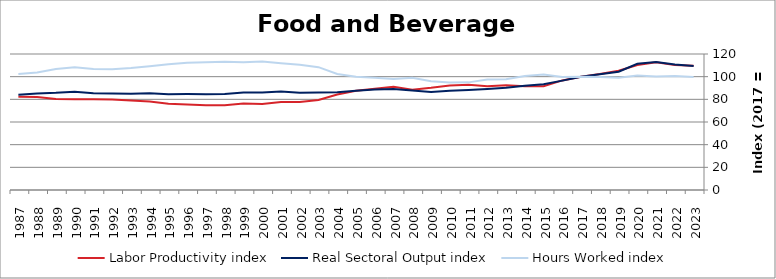
| Category | Labor Productivity index | Real Sectoral Output index | Hours Worked index |
|---|---|---|---|
| 2023.0 | 109.742 | 109.37 | 99.661 |
| 2022.0 | 110.192 | 110.782 | 100.536 |
| 2021.0 | 112.767 | 112.848 | 100.071 |
| 2020.0 | 110.234 | 111.313 | 100.98 |
| 2019.0 | 105.302 | 104.385 | 99.129 |
| 2018.0 | 102.443 | 102.046 | 99.612 |
| 2017.0 | 100 | 100 | 100 |
| 2016.0 | 96.7 | 96.519 | 99.812 |
| 2015.0 | 91.488 | 93.223 | 101.896 |
| 2014.0 | 91.461 | 92.039 | 100.632 |
| 2013.0 | 92.357 | 90.233 | 97.7 |
| 2012.0 | 91.45 | 89.077 | 97.406 |
| 2011.0 | 92.947 | 88.273 | 94.971 |
| 2010.0 | 92.263 | 87.505 | 94.843 |
| 2009.0 | 90.134 | 86.412 | 95.871 |
| 2008.0 | 88.504 | 87.692 | 99.082 |
| 2007.0 | 90.994 | 89.109 | 97.929 |
| 2006.0 | 89.434 | 88.599 | 99.067 |
| 2005.0 | 87.636 | 87.562 | 99.916 |
| 2004.0 | 84.287 | 86.292 | 102.379 |
| 2003.0 | 79.362 | 86.014 | 108.383 |
| 2002.0 | 77.656 | 85.787 | 110.471 |
| 2001.0 | 77.675 | 86.85 | 111.812 |
| 2000.0 | 75.914 | 86.042 | 113.342 |
| 1999.0 | 76.27 | 86.009 | 112.77 |
| 1998.0 | 74.78 | 84.605 | 113.139 |
| 1997.0 | 74.835 | 84.433 | 112.826 |
| 1996.0 | 75.423 | 84.635 | 112.215 |
| 1995.0 | 76.183 | 84.507 | 110.926 |
| 1994.0 | 78.124 | 85.345 | 109.243 |
| 1993.0 | 78.883 | 84.928 | 107.663 |
| 1992.0 | 79.945 | 85.175 | 106.541 |
| 1991.0 | 79.971 | 85.413 | 106.806 |
| 1990.0 | 80.079 | 86.767 | 108.352 |
| 1989.0 | 80.335 | 85.719 | 106.701 |
| 1988.0 | 82.068 | 85.167 | 103.777 |
| 1987.0 | 82.207 | 84.088 | 102.288 |